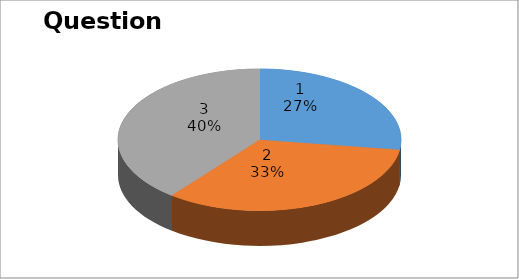
| Category | Series 0 |
|---|---|
| 0 | 9 |
| 1 | 11 |
| 2 | 13 |